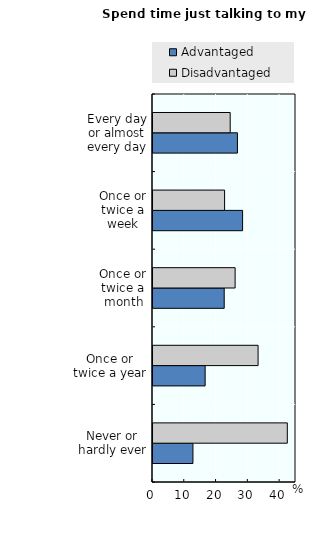
| Category | Advantaged | Disadvantaged |
|---|---|---|
| Never or hardly ever | 12.57 | 42.27 |
| Once or twice a year | 16.41 | 33.07 |
| Once or twice a month | 22.41 | 25.84 |
| Once or twice a week | 28.19 | 22.53 |
| Every day or almost every day | 26.57 | 24.29 |